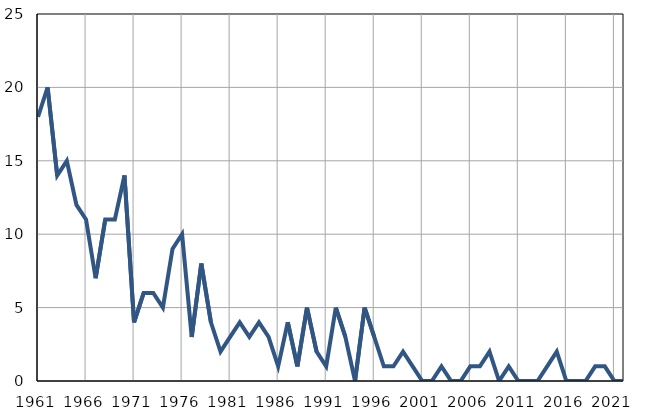
| Category | Infants
deaths |
|---|---|
| 1961.0 | 18 |
| 1962.0 | 20 |
| 1963.0 | 14 |
| 1964.0 | 15 |
| 1965.0 | 12 |
| 1966.0 | 11 |
| 1967.0 | 7 |
| 1968.0 | 11 |
| 1969.0 | 11 |
| 1970.0 | 14 |
| 1971.0 | 4 |
| 1972.0 | 6 |
| 1973.0 | 6 |
| 1974.0 | 5 |
| 1975.0 | 9 |
| 1976.0 | 10 |
| 1977.0 | 3 |
| 1978.0 | 8 |
| 1979.0 | 4 |
| 1980.0 | 2 |
| 1981.0 | 3 |
| 1982.0 | 4 |
| 1983.0 | 3 |
| 1984.0 | 4 |
| 1985.0 | 3 |
| 1986.0 | 1 |
| 1987.0 | 4 |
| 1988.0 | 1 |
| 1989.0 | 5 |
| 1990.0 | 2 |
| 1991.0 | 1 |
| 1992.0 | 5 |
| 1993.0 | 3 |
| 1994.0 | 0 |
| 1995.0 | 5 |
| 1996.0 | 3 |
| 1997.0 | 1 |
| 1998.0 | 1 |
| 1999.0 | 2 |
| 2000.0 | 1 |
| 2001.0 | 0 |
| 2002.0 | 0 |
| 2003.0 | 1 |
| 2004.0 | 0 |
| 2005.0 | 0 |
| 2006.0 | 1 |
| 2007.0 | 1 |
| 2008.0 | 2 |
| 2009.0 | 0 |
| 2010.0 | 1 |
| 2011.0 | 0 |
| 2012.0 | 0 |
| 2013.0 | 0 |
| 2014.0 | 1 |
| 2015.0 | 2 |
| 2016.0 | 0 |
| 2017.0 | 0 |
| 2018.0 | 0 |
| 2019.0 | 1 |
| 2020.0 | 1 |
| 2021.0 | 0 |
| 2022.0 | 0 |